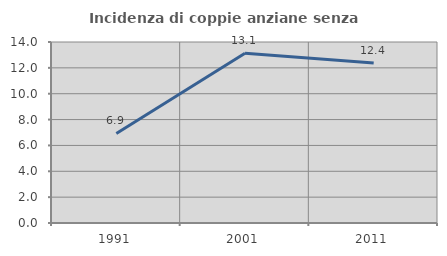
| Category | Incidenza di coppie anziane senza figli  |
|---|---|
| 1991.0 | 6.928 |
| 2001.0 | 13.136 |
| 2011.0 | 12.373 |